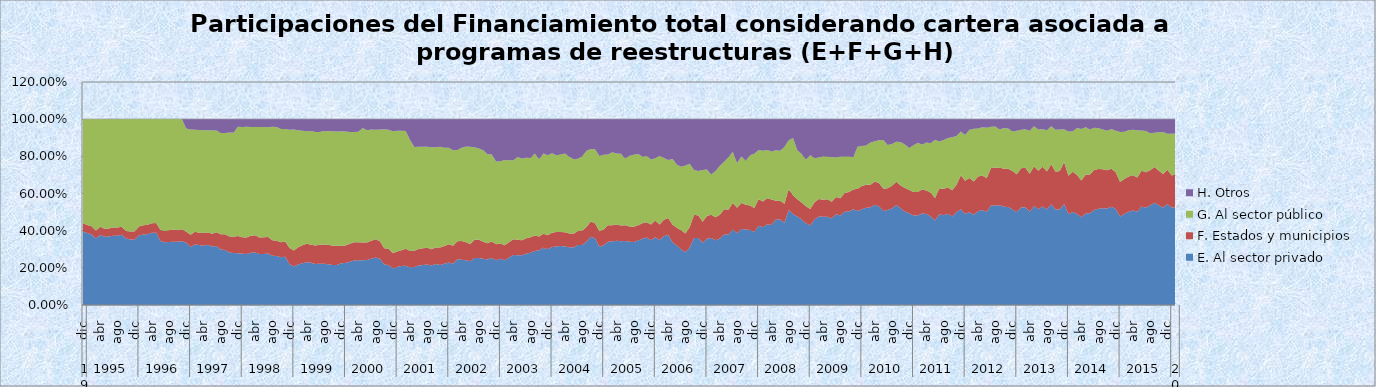
| Category | E. Al sector privado  | F. Estados y municipios  | G. Al sector público  | H. Otros  |
|---|---|---|---|---|
| 0 | 0.395 | 0.045 | 0.561 | 0 |
| 1 | 0.387 | 0.044 | 0.569 | 0 |
| 2 | 0.38 | 0.044 | 0.576 | 0 |
| 3 | 0.357 | 0.042 | 0.601 | 0 |
| 4 | 0.377 | 0.043 | 0.58 | 0 |
| 5 | 0.368 | 0.043 | 0.589 | 0 |
| 6 | 0.369 | 0.043 | 0.588 | 0 |
| 7 | 0.373 | 0.044 | 0.583 | 0 |
| 8 | 0.373 | 0.044 | 0.583 | 0 |
| 9 | 0.378 | 0.043 | 0.579 | 0 |
| 10 | 0.358 | 0.039 | 0.602 | 0 |
| 11 | 0.352 | 0.043 | 0.604 | 0 |
| 12 | 0.351 | 0.045 | 0.605 | 0 |
| 13 | 0.374 | 0.048 | 0.577 | 0 |
| 14 | 0.38 | 0.05 | 0.571 | 0 |
| 15 | 0.381 | 0.05 | 0.569 | 0 |
| 16 | 0.388 | 0.051 | 0.56 | 0 |
| 17 | 0.388 | 0.054 | 0.558 | 0 |
| 18 | 0.344 | 0.059 | 0.597 | 0 |
| 19 | 0.338 | 0.061 | 0.601 | 0 |
| 20 | 0.339 | 0.064 | 0.597 | 0 |
| 21 | 0.341 | 0.066 | 0.593 | 0 |
| 22 | 0.34 | 0.062 | 0.598 | 0 |
| 23 | 0.343 | 0.064 | 0.592 | 0 |
| 24 | 0.335 | 0.06 | 0.555 | 0.051 |
| 25 | 0.313 | 0.066 | 0.567 | 0.055 |
| 26 | 0.326 | 0.068 | 0.549 | 0.057 |
| 27 | 0.323 | 0.067 | 0.552 | 0.058 |
| 28 | 0.319 | 0.068 | 0.553 | 0.059 |
| 29 | 0.324 | 0.067 | 0.55 | 0.059 |
| 30 | 0.314 | 0.07 | 0.557 | 0.059 |
| 31 | 0.318 | 0.074 | 0.548 | 0.06 |
| 32 | 0.298 | 0.082 | 0.546 | 0.074 |
| 33 | 0.296 | 0.085 | 0.544 | 0.075 |
| 34 | 0.283 | 0.086 | 0.559 | 0.072 |
| 35 | 0.28 | 0.087 | 0.559 | 0.073 |
| 36 | 0.279 | 0.092 | 0.588 | 0.041 |
| 37 | 0.275 | 0.09 | 0.593 | 0.042 |
| 38 | 0.274 | 0.09 | 0.595 | 0.041 |
| 39 | 0.281 | 0.092 | 0.586 | 0.042 |
| 40 | 0.282 | 0.092 | 0.583 | 0.042 |
| 41 | 0.275 | 0.089 | 0.595 | 0.041 |
| 42 | 0.275 | 0.089 | 0.594 | 0.042 |
| 43 | 0.277 | 0.089 | 0.591 | 0.043 |
| 44 | 0.266 | 0.083 | 0.61 | 0.041 |
| 45 | 0.264 | 0.082 | 0.612 | 0.042 |
| 46 | 0.256 | 0.081 | 0.61 | 0.053 |
| 47 | 0.259 | 0.082 | 0.605 | 0.053 |
| 48 | 0.22 | 0.087 | 0.636 | 0.057 |
| 49 | 0.207 | 0.086 | 0.651 | 0.055 |
| 50 | 0.218 | 0.092 | 0.63 | 0.06 |
| 51 | 0.225 | 0.096 | 0.616 | 0.063 |
| 52 | 0.23 | 0.099 | 0.605 | 0.065 |
| 53 | 0.227 | 0.097 | 0.612 | 0.064 |
| 54 | 0.22 | 0.1 | 0.612 | 0.069 |
| 55 | 0.223 | 0.102 | 0.607 | 0.069 |
| 56 | 0.223 | 0.103 | 0.611 | 0.064 |
| 57 | 0.219 | 0.104 | 0.612 | 0.065 |
| 58 | 0.216 | 0.103 | 0.617 | 0.065 |
| 59 | 0.216 | 0.103 | 0.615 | 0.066 |
| 60 | 0.225 | 0.094 | 0.616 | 0.065 |
| 61 | 0.226 | 0.094 | 0.614 | 0.066 |
| 62 | 0.232 | 0.097 | 0.602 | 0.069 |
| 63 | 0.24 | 0.098 | 0.594 | 0.069 |
| 64 | 0.241 | 0.097 | 0.594 | 0.068 |
| 65 | 0.241 | 0.095 | 0.616 | 0.048 |
| 66 | 0.242 | 0.094 | 0.605 | 0.059 |
| 67 | 0.248 | 0.097 | 0.599 | 0.056 |
| 68 | 0.256 | 0.098 | 0.589 | 0.057 |
| 69 | 0.248 | 0.095 | 0.6 | 0.056 |
| 70 | 0.219 | 0.087 | 0.64 | 0.054 |
| 71 | 0.216 | 0.087 | 0.64 | 0.057 |
| 72 | 0.197 | 0.082 | 0.656 | 0.065 |
| 73 | 0.204 | 0.084 | 0.649 | 0.062 |
| 74 | 0.209 | 0.085 | 0.643 | 0.063 |
| 75 | 0.211 | 0.091 | 0.634 | 0.063 |
| 76 | 0.202 | 0.088 | 0.597 | 0.113 |
| 77 | 0.204 | 0.088 | 0.559 | 0.149 |
| 78 | 0.213 | 0.089 | 0.55 | 0.148 |
| 79 | 0.215 | 0.09 | 0.546 | 0.149 |
| 80 | 0.218 | 0.09 | 0.543 | 0.149 |
| 81 | 0.212 | 0.088 | 0.549 | 0.151 |
| 82 | 0.22 | 0.09 | 0.539 | 0.151 |
| 83 | 0.216 | 0.094 | 0.542 | 0.149 |
| 84 | 0.222 | 0.095 | 0.528 | 0.154 |
| 85 | 0.229 | 0.097 | 0.519 | 0.154 |
| 86 | 0.222 | 0.097 | 0.514 | 0.167 |
| 87 | 0.247 | 0.096 | 0.492 | 0.166 |
| 88 | 0.244 | 0.1 | 0.503 | 0.153 |
| 89 | 0.241 | 0.096 | 0.515 | 0.148 |
| 90 | 0.235 | 0.093 | 0.524 | 0.148 |
| 91 | 0.252 | 0.099 | 0.498 | 0.151 |
| 92 | 0.253 | 0.098 | 0.491 | 0.157 |
| 93 | 0.249 | 0.092 | 0.491 | 0.168 |
| 94 | 0.245 | 0.087 | 0.478 | 0.189 |
| 95 | 0.253 | 0.088 | 0.469 | 0.19 |
| 96 | 0.241 | 0.086 | 0.446 | 0.228 |
| 97 | 0.248 | 0.083 | 0.442 | 0.227 |
| 98 | 0.241 | 0.081 | 0.458 | 0.22 |
| 99 | 0.256 | 0.081 | 0.441 | 0.221 |
| 100 | 0.269 | 0.084 | 0.426 | 0.221 |
| 101 | 0.268 | 0.083 | 0.445 | 0.204 |
| 102 | 0.267 | 0.081 | 0.44 | 0.212 |
| 103 | 0.276 | 0.083 | 0.433 | 0.208 |
| 104 | 0.282 | 0.083 | 0.427 | 0.209 |
| 105 | 0.29 | 0.084 | 0.442 | 0.184 |
| 106 | 0.294 | 0.074 | 0.416 | 0.216 |
| 107 | 0.308 | 0.076 | 0.431 | 0.185 |
| 108 | 0.3 | 0.075 | 0.431 | 0.194 |
| 109 | 0.312 | 0.077 | 0.427 | 0.184 |
| 110 | 0.315 | 0.077 | 0.413 | 0.195 |
| 111 | 0.318 | 0.076 | 0.416 | 0.19 |
| 112 | 0.315 | 0.076 | 0.424 | 0.184 |
| 113 | 0.311 | 0.075 | 0.412 | 0.203 |
| 114 | 0.31 | 0.073 | 0.401 | 0.216 |
| 115 | 0.323 | 0.075 | 0.388 | 0.213 |
| 116 | 0.323 | 0.076 | 0.4 | 0.201 |
| 117 | 0.34 | 0.08 | 0.409 | 0.17 |
| 118 | 0.367 | 0.082 | 0.389 | 0.161 |
| 119 | 0.359 | 0.08 | 0.399 | 0.161 |
| 120 | 0.313 | 0.083 | 0.405 | 0.198 |
| 121 | 0.321 | 0.085 | 0.403 | 0.191 |
| 122 | 0.34 | 0.089 | 0.381 | 0.19 |
| 123 | 0.342 | 0.088 | 0.392 | 0.179 |
| 124 | 0.345 | 0.088 | 0.381 | 0.185 |
| 125 | 0.342 | 0.085 | 0.387 | 0.186 |
| 126 | 0.344 | 0.085 | 0.36 | 0.211 |
| 127 | 0.341 | 0.082 | 0.38 | 0.197 |
| 128 | 0.339 | 0.082 | 0.388 | 0.191 |
| 129 | 0.347 | 0.083 | 0.383 | 0.188 |
| 130 | 0.357 | 0.083 | 0.359 | 0.201 |
| 131 | 0.364 | 0.082 | 0.356 | 0.198 |
| 132 | 0.349 | 0.084 | 0.35 | 0.218 |
| 133 | 0.365 | 0.091 | 0.334 | 0.211 |
| 134 | 0.349 | 0.084 | 0.369 | 0.197 |
| 135 | 0.371 | 0.088 | 0.333 | 0.208 |
| 136 | 0.377 | 0.09 | 0.312 | 0.22 |
| 137 | 0.336 | 0.095 | 0.355 | 0.214 |
| 138 | 0.32 | 0.096 | 0.34 | 0.244 |
| 139 | 0.299 | 0.104 | 0.342 | 0.256 |
| 140 | 0.284 | 0.1 | 0.367 | 0.249 |
| 141 | 0.31 | 0.11 | 0.34 | 0.241 |
| 142 | 0.36 | 0.125 | 0.242 | 0.273 |
| 143 | 0.36 | 0.122 | 0.239 | 0.279 |
| 144 | 0.335 | 0.112 | 0.279 | 0.273 |
| 145 | 0.357 | 0.123 | 0.249 | 0.271 |
| 146 | 0.36 | 0.126 | 0.216 | 0.298 |
| 147 | 0.348 | 0.125 | 0.249 | 0.279 |
| 148 | 0.358 | 0.128 | 0.263 | 0.251 |
| 149 | 0.38 | 0.135 | 0.256 | 0.229 |
| 150 | 0.379 | 0.133 | 0.283 | 0.205 |
| 151 | 0.406 | 0.143 | 0.275 | 0.175 |
| 152 | 0.386 | 0.137 | 0.24 | 0.237 |
| 153 | 0.409 | 0.14 | 0.252 | 0.199 |
| 154 | 0.407 | 0.133 | 0.234 | 0.226 |
| 155 | 0.403 | 0.132 | 0.271 | 0.194 |
| 156 | 0.392 | 0.13 | 0.291 | 0.187 |
| 157 | 0.426 | 0.143 | 0.264 | 0.166 |
| 158 | 0.418 | 0.139 | 0.273 | 0.17 |
| 159 | 0.435 | 0.139 | 0.26 | 0.166 |
| 160 | 0.431 | 0.137 | 0.257 | 0.175 |
| 161 | 0.46 | 0.101 | 0.272 | 0.168 |
| 162 | 0.46 | 0.1 | 0.27 | 0.17 |
| 163 | 0.443 | 0.102 | 0.305 | 0.15 |
| 164 | 0.511 | 0.111 | 0.263 | 0.114 |
| 165 | 0.488 | 0.102 | 0.308 | 0.101 |
| 166 | 0.476 | 0.093 | 0.263 | 0.168 |
| 167 | 0.46 | 0.092 | 0.261 | 0.187 |
| 168 | 0.44 | 0.091 | 0.251 | 0.218 |
| 169 | 0.427 | 0.089 | 0.29 | 0.193 |
| 170 | 0.459 | 0.094 | 0.236 | 0.21 |
| 171 | 0.477 | 0.093 | 0.224 | 0.206 |
| 172 | 0.475 | 0.092 | 0.234 | 0.2 |
| 173 | 0.475 | 0.093 | 0.23 | 0.202 |
| 174 | 0.465 | 0.091 | 0.24 | 0.204 |
| 175 | 0.488 | 0.093 | 0.213 | 0.206 |
| 176 | 0.482 | 0.093 | 0.224 | 0.201 |
| 177 | 0.502 | 0.101 | 0.197 | 0.2 |
| 178 | 0.504 | 0.105 | 0.191 | 0.201 |
| 179 | 0.516 | 0.107 | 0.173 | 0.205 |
| 180 | 0.506 | 0.12 | 0.226 | 0.148 |
| 181 | 0.515 | 0.125 | 0.216 | 0.145 |
| 182 | 0.523 | 0.124 | 0.212 | 0.141 |
| 183 | 0.524 | 0.123 | 0.227 | 0.126 |
| 184 | 0.539 | 0.126 | 0.217 | 0.118 |
| 185 | 0.531 | 0.124 | 0.232 | 0.113 |
| 186 | 0.506 | 0.119 | 0.263 | 0.112 |
| 187 | 0.511 | 0.118 | 0.232 | 0.139 |
| 188 | 0.52 | 0.122 | 0.225 | 0.133 |
| 189 | 0.538 | 0.126 | 0.214 | 0.122 |
| 190 | 0.52 | 0.122 | 0.234 | 0.123 |
| 191 | 0.502 | 0.127 | 0.234 | 0.136 |
| 192 | 0.493 | 0.126 | 0.226 | 0.155 |
| 193 | 0.482 | 0.127 | 0.25 | 0.141 |
| 194 | 0.481 | 0.127 | 0.265 | 0.127 |
| 195 | 0.492 | 0.129 | 0.241 | 0.138 |
| 196 | 0.49 | 0.127 | 0.258 | 0.126 |
| 197 | 0.476 | 0.128 | 0.266 | 0.13 |
| 198 | 0.455 | 0.122 | 0.313 | 0.11 |
| 199 | 0.488 | 0.139 | 0.253 | 0.12 |
| 200 | 0.483 | 0.142 | 0.262 | 0.113 |
| 201 | 0.492 | 0.141 | 0.266 | 0.101 |
| 202 | 0.476 | 0.141 | 0.286 | 0.097 |
| 203 | 0.5 | 0.147 | 0.262 | 0.091 |
| 204 | 0.516 | 0.182 | 0.235 | 0.067 |
| 205 | 0.489 | 0.179 | 0.246 | 0.086 |
| 206 | 0.499 | 0.184 | 0.26 | 0.057 |
| 207 | 0.486 | 0.178 | 0.285 | 0.051 |
| 208 | 0.505 | 0.187 | 0.257 | 0.051 |
| 209 | 0.511 | 0.185 | 0.261 | 0.043 |
| 210 | 0.5 | 0.181 | 0.272 | 0.047 |
| 211 | 0.536 | 0.201 | 0.223 | 0.04 |
| 212 | 0.536 | 0.202 | 0.222 | 0.039 |
| 213 | 0.537 | 0.203 | 0.205 | 0.056 |
| 214 | 0.528 | 0.205 | 0.219 | 0.048 |
| 215 | 0.528 | 0.205 | 0.217 | 0.05 |
| 216 | 0.514 | 0.207 | 0.213 | 0.066 |
| 217 | 0.501 | 0.204 | 0.233 | 0.063 |
| 218 | 0.525 | 0.212 | 0.207 | 0.056 |
| 219 | 0.526 | 0.213 | 0.206 | 0.055 |
| 220 | 0.502 | 0.205 | 0.232 | 0.062 |
| 221 | 0.533 | 0.214 | 0.215 | 0.038 |
| 222 | 0.515 | 0.207 | 0.222 | 0.056 |
| 223 | 0.53 | 0.214 | 0.203 | 0.054 |
| 224 | 0.513 | 0.204 | 0.223 | 0.059 |
| 225 | 0.542 | 0.215 | 0.205 | 0.038 |
| 226 | 0.513 | 0.204 | 0.225 | 0.057 |
| 227 | 0.513 | 0.208 | 0.223 | 0.056 |
| 228 | 0.543 | 0.227 | 0.175 | 0.055 |
| 229 | 0.489 | 0.207 | 0.238 | 0.067 |
| 230 | 0.501 | 0.216 | 0.217 | 0.066 |
| 231 | 0.49 | 0.21 | 0.253 | 0.047 |
| 232 | 0.472 | 0.199 | 0.276 | 0.053 |
| 233 | 0.493 | 0.208 | 0.256 | 0.044 |
| 234 | 0.493 | 0.209 | 0.241 | 0.056 |
| 235 | 0.511 | 0.216 | 0.227 | 0.047 |
| 236 | 0.519 | 0.213 | 0.219 | 0.049 |
| 237 | 0.521 | 0.21 | 0.214 | 0.055 |
| 238 | 0.52 | 0.205 | 0.213 | 0.062 |
| 239 | 0.529 | 0.205 | 0.213 | 0.053 |
| 240 | 0.516 | 0.198 | 0.224 | 0.062 |
| 241 | 0.477 | 0.185 | 0.268 | 0.07 |
| 242 | 0.49 | 0.187 | 0.255 | 0.067 |
| 243 | 0.502 | 0.19 | 0.249 | 0.06 |
| 244 | 0.509 | 0.19 | 0.245 | 0.057 |
| 245 | 0.501 | 0.184 | 0.255 | 0.059 |
| 246 | 0.53 | 0.192 | 0.216 | 0.062 |
| 247 | 0.524 | 0.191 | 0.221 | 0.064 |
| 248 | 0.535 | 0.19 | 0.199 | 0.076 |
| 249 | 0.55 | 0.192 | 0.185 | 0.073 |
| 250 | 0.536 | 0.186 | 0.207 | 0.07 |
| 251 | 0.524 | 0.182 | 0.226 | 0.069 |
| 252 | 0.543 | 0.185 | 0.193 | 0.079 |
| 253 | 0.523 | 0.175 | 0.224 | 0.079 |
| 254 | 0.527 | 0.177 | 0.22 | 0.076 |